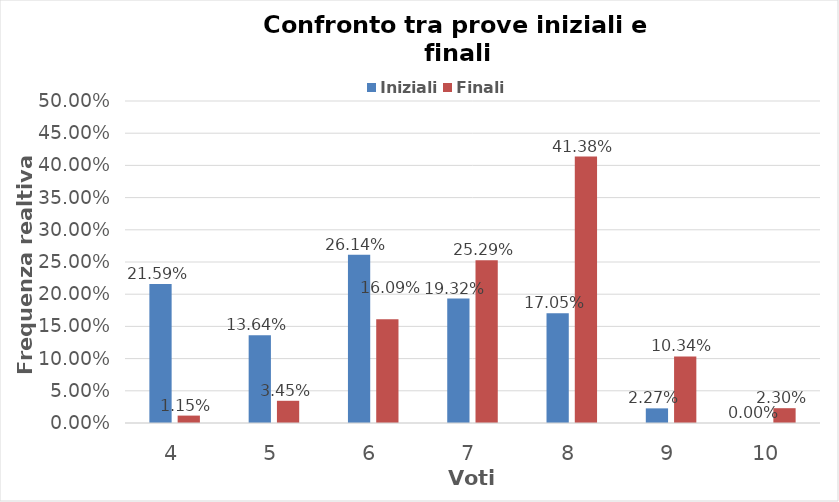
| Category | Iniziali | Finali |
|---|---|---|
| 4.0 | 0.216 | 0.011 |
| 5.0 | 0.136 | 0.034 |
| 6.0 | 0.261 | 0.161 |
| 7.0 | 0.193 | 0.253 |
| 8.0 | 0.17 | 0.414 |
| 9.0 | 0.023 | 0.103 |
| 10.0 | 0 | 0.023 |